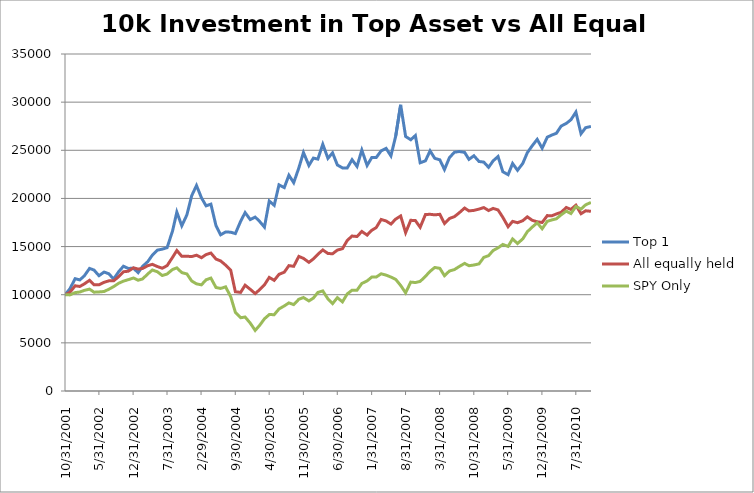
| Category | Top 1 | All equally held | SPY Only |
|---|---|---|---|
| 11/2/10 | 27475.351 | 18663.036 | 19579.977 |
| 9/30/10 | 27347.694 | 18715.2 | 19338.32 |
| 9/1/10 | 26718.451 | 18410.368 | 18893.364 |
| 7/31/10 | 28968.561 | 19298.676 | 19158.036 |
| 6/30/10 | 28171.379 | 18857.113 | 18430.188 |
| 6/1/10 | 27792.075 | 19058.196 | 18681.435 |
| 4/30/10 | 27514.701 | 18562.944 | 18303.606 |
| 3/31/10 | 26764.619 | 18387.576 | 17888.377 |
| 3/2/10 | 26579.531 | 18196.397 | 17764.672 |
| 2/2/10 | 26361.443 | 18216.385 | 17618.911 |
| 1/1/10 | 25213.609 | 17501.82 | 16851.745 |
| 12/1/09 | 26134.746 | 17573.619 | 17467.395 |
| 10/31/09 | 25474.741 | 17727.842 | 17026.275 |
| 9/30/09 | 24741.562 | 18087.157 | 16536.249 |
| 9/2/09 | 23645.381 | 17690.416 | 15803.606 |
| 7/31/09 | 22920.81 | 17479.554 | 15319.333 |
| 6/30/09 | 23629.598 | 17617.074 | 15793.057 |
| 6/2/09 | 22468.851 | 17063.879 | 15017.261 |
| 4/30/09 | 22771.592 | 18038.669 | 15219.601 |
| 3/31/09 | 24354.268 | 18806.188 | 14868.623 |
| 2/28/09 | 23895.613 | 18963.987 | 14588.608 |
| 1/31/09 | 23229.419 | 18742.746 | 14055.428 |
| 1/1/09 | 23772.215 | 19050.495 | 13878.021 |
| 12/2/08 | 23838.679 | 18892.133 | 13201.956 |
| 10/31/08 | 24431.63 | 18757.677 | 13084.964 |
| 9/30/08 | 24055.759 | 18705.718 | 13011.124 |
| 9/3/08 | 24785.377 | 19004.106 | 13252.781 |
| 7/31/08 | 24873.395 | 18502.33 | 12924.818 |
| 7/1/08 | 24794.956 | 18107.051 | 12609.321 |
| 5/31/08 | 24233.498 | 17917.907 | 12461.642 |
| 4/30/08 | 22999.117 | 17402.471 | 11975.451 |
| 4/1/08 | 24006.438 | 18351.939 | 12740.698 |
| 2/29/08 | 24169.059 | 18293.179 | 12827.004 |
| 1/31/08 | 24942.61 | 18352.445 | 12427.119 |
| 1/2/08 | 23905.18 | 18328.992 | 11910.242 |
| 11/30/07 | 23701.63 | 17004.188 | 11381.857 |
| 10/31/07 | 26530.419 | 17702.301 | 11263.905 |
| 10/2/07 | 26095.341 | 17726.794 | 11309.935 |
| 8/31/07 | 26434.831 | 16446.633 | 10197.545 |
| 7/31/07 | 29722.879 | 18179.194 | 10957.998 |
| 6/30/07 | 26473.298 | 17851.236 | 11595.704 |
| 5/31/07 | 24417.85 | 17341.02 | 11832.566 |
| 5/1/07 | 25197.241 | 17656.211 | 12034.906 |
| 3/31/07 | 24945.085 | 17815.692 | 12172.037 |
| 2/28/07 | 24241.521 | 16972.871 | 11828.73 |
| 1/31/07 | 24239.556 | 16687.108 | 11827.771 |
| 1/2/07 | 23425.937 | 16195.634 | 11430.763 |
| 11/30/06 | 25022.299 | 16570.235 | 11169.927 |
| 10/31/06 | 23324.919 | 16044.949 | 10470.848 |
| 9/30/06 | 24021.856 | 16094.578 | 10470.848 |
| 8/31/06 | 23168.72 | 15640.138 | 10085.347 |
| 8/1/06 | 23171.281 | 14780.678 | 9255.85 |
| 6/30/06 | 23475.744 | 14635.416 | 9692.175 |
| 5/31/06 | 24733.99 | 14251.493 | 9072.689 |
| 5/2/06 | 24164.832 | 14283.741 | 9567.511 |
| 3/31/06 | 25621.374 | 14648.735 | 10393.172 |
| 2/28/06 | 24084.55 | 14197.942 | 10234.944 |
| 1/31/06 | 24190.659 | 13715.428 | 9648.063 |
| 1/3/06 | 23423.579 | 13365.287 | 9355.581 |
| 11/30/05 | 24766.127 | 13773.755 | 9708.477 |
| 11/1/05 | 23165.397 | 13979.597 | 9526.275 |
| 9/30/05 | 21635.668 | 12949.805 | 8973.916 |
| 8/31/05 | 22411.524 | 13020.522 | 9149.405 |
| 8/2/05 | 21127.961 | 12340.228 | 8836.786 |
| 6/30/05 | 21409.754 | 12117.057 | 8521.289 |
| 5/31/05 | 19286.473 | 11490.851 | 7929.613 |
| 4/30/05 | 19732.1 | 11798.205 | 7935.366 |
| 3/31/05 | 17019.018 | 11025.822 | 7497.123 |
| 3/1/05 | 17606.015 | 10518.478 | 6819.141 |
| 2/1/05 | 18064.302 | 10119.877 | 6294.591 |
| 1/1/05 | 17806.881 | 10564.963 | 7053.126 |
| 11/30/04 | 18528.161 | 10986.48 | 7684.12 |
| 11/2/04 | 17618.911 | 10242.616 | 7609.321 |
| 9/30/04 | 16351.206 | 10309.351 | 8178.941 |
| 9/1/04 | 16493.277 | 12540.458 | 9796.701 |
| 7/31/04 | 16517.319 | 13074.816 | 10815.113 |
| 6/30/04 | 16222.612 | 13510.129 | 10651.132 |
| 6/1/04 | 17165.886 | 13701.165 | 10747.027 |
| 4/30/04 | 19406.368 | 14327.532 | 11727.081 |
| 3/31/04 | 19228.837 | 14169.117 | 11552.551 |
| 3/2/04 | 20063.234 | 13844.552 | 11027.043 |
| 1/31/04 | 21343.677 | 14102.014 | 11126.774 |
| 1/1/04 | 20282.928 | 13962.609 | 11422.133 |
| 12/2/03 | 18299.018 | 13997.27 | 12156.694 |
| 10/31/03 | 17158.381 | 13985.697 | 12295.742 |
| 9/30/03 | 18580.917 | 14593.514 | 12790.564 |
| 9/3/03 | 16607.722 | 13875.189 | 12619.87 |
| 7/31/03 | 14886.913 | 13016.322 | 12149.022 |
| 7/1/03 | 14733.952 | 12753.05 | 11995.589 |
| 5/31/03 | 14626.879 | 12928.232 | 12383.007 |
| 4/30/03 | 14110.636 | 13155.688 | 12567.127 |
| 4/1/03 | 13429.961 | 13012.14 | 12154.776 |
| 2/28/03 | 12948.134 | 12727.35 | 11638.857 |
| 1/31/03 | 12290.403 | 12661.373 | 11505.562 |
| 1/2/03 | 12745.891 | 12793.725 | 11735.712 |
| 11/30/02 | 12730.544 | 12438.229 | 11562.14 |
| 10/31/02 | 12958.674 | 12386.416 | 11409.666 |
| 10/1/02 | 12385.15 | 11875.27 | 11187.188 |
| 8/31/02 | 11630.4 | 11441.256 | 10844.841 |
| 7/31/02 | 12181.9 | 11437.693 | 10560.031 |
| 7/2/02 | 12352.044 | 11286.775 | 10334.676 |
| 5/31/02 | 11974.598 | 11030.443 | 10288.646 |
| 4/30/02 | 12561.301 | 11040.026 | 10261.795 |
| 4/2/02 | 12729.489 | 11496.017 | 10580.169 |
| 2/28/02 | 11954.174 | 11118.21 | 10448.792 |
| 1/31/02 | 11536.498 | 10856.285 | 10279.056 |
| 1/2/02 | 11666.122 | 10928.349 | 10220.56 |
| 11/30/01 | 10612.673 | 10239.51 | 9980.821 |
| 10/31/01 | 10000 | 10000 | 10000 |